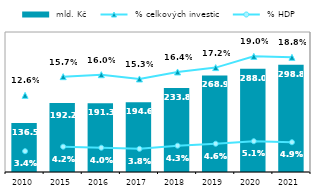
| Category |  mld. Kč |
|---|---|
| 2010.0 | 136.519 |
| 2015.0 | 192.247 |
| 2016.0 | 191.276 |
| 2017.0 | 194.625 |
| 2018.0 | 233.83 |
| 2019.0 | 268.874 |
| 2020.0 | 287.958 |
| 2021.0 | 298.849 |